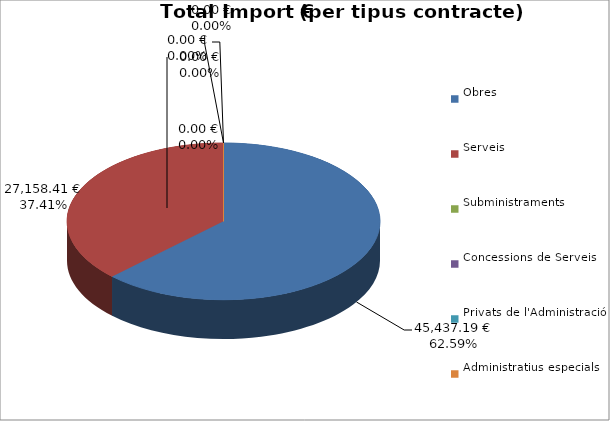
| Category | Total preu
(amb IVA) |
|---|---|
| Obres | 45437.19 |
| Serveis | 27158.41 |
| Subministraments | 0 |
| Concessions de Serveis | 0 |
| Privats de l'Administració | 0 |
| Administratius especials | 0 |